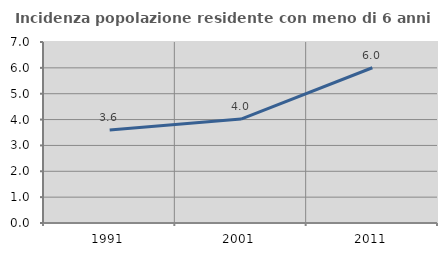
| Category | Incidenza popolazione residente con meno di 6 anni |
|---|---|
| 1991.0 | 3.596 |
| 2001.0 | 4.019 |
| 2011.0 | 6.003 |